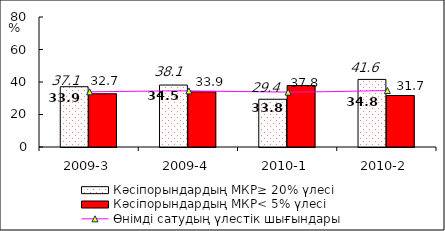
| Category | Кәсіпорындардың МКР≥ 20% үлесі | Кәсіпорындардың МКР< 5% үлесі |
|---|---|---|
| 2009-3 | 37.097 | 32.742 |
| 2009-4 | 38.119 | 33.937 |
| 2010-1 | 29.382 | 37.833 |
| 2010-2 | 41.596 | 31.695 |